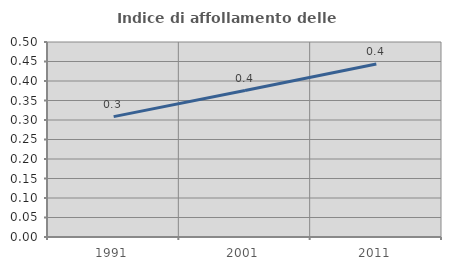
| Category | Indice di affollamento delle abitazioni  |
|---|---|
| 1991.0 | 0.309 |
| 2001.0 | 0.376 |
| 2011.0 | 0.444 |